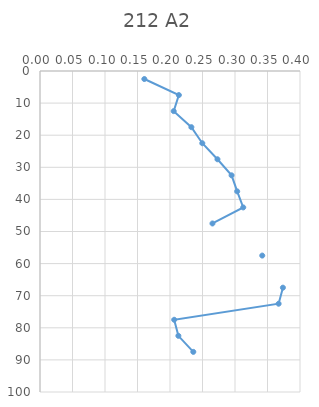
| Category | Series 0 |
|---|---|
| 0.160533707865168 | 2.5 |
| 0.213627164380481 | 7.5 |
| 0.205691116306254 | 12.5 |
| 0.232891533675954 | 17.5 |
| 0.249694982461492 | 22.5 |
| 0.273023930384336 | 27.5 |
| 0.294754697286013 | 32.5 |
| 0.303373748023195 | 37.5 |
| 0.312682357517993 | 42.5 |
| 0.265323992994746 | 47.5 |
| nan | 52.5 |
| 0.341924398625429 | 57.5 |
| nan | 62.5 |
| 0.373701002734731 | 67.5 |
| 0.367121314808539 | 72.5 |
| 0.206433148758788 | 77.5 |
| 0.212889955433665 | 82.5 |
| 0.235849874317414 | 87.5 |